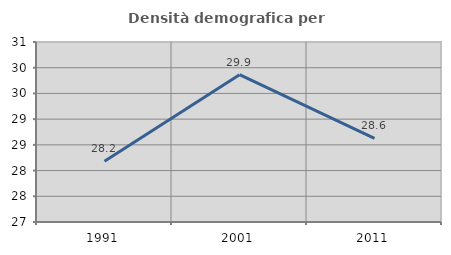
| Category | Densità demografica |
|---|---|
| 1991.0 | 28.183 |
| 2001.0 | 29.864 |
| 2011.0 | 28.628 |